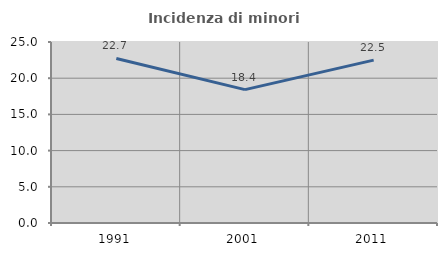
| Category | Incidenza di minori stranieri |
|---|---|
| 1991.0 | 22.727 |
| 2001.0 | 18.421 |
| 2011.0 | 22.5 |